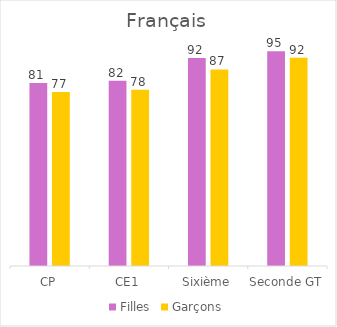
| Category | Filles | Garçons |
|---|---|---|
| CP | 81 | 77 |
| CE1 | 82 | 78 |
| Sixième | 92 | 87 |
| Seconde GT | 95 | 92.2 |